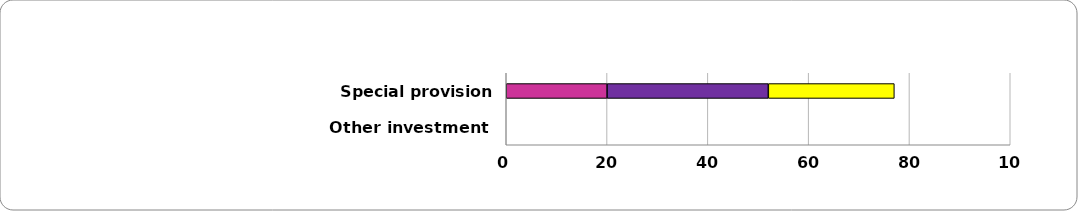
| Category | Alternative provision/PRU | Independent and non-maintained | Mainstream provision (not unit) | Special provision | Special unit or resourced provision | Other |
|---|---|---|---|---|---|---|
| Special provision fund | 20 | 0 | 0 | 32 | 25 | 0 |
| Other investment | 0 | 0 | 0 | 0 | 0 | 0 |